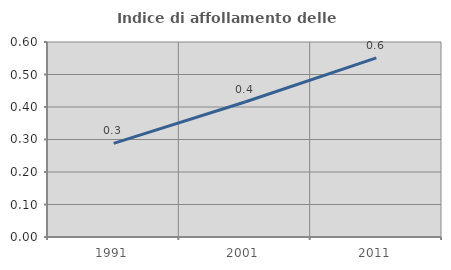
| Category | Indice di affollamento delle abitazioni  |
|---|---|
| 1991.0 | 0.288 |
| 2001.0 | 0.416 |
| 2011.0 | 0.551 |